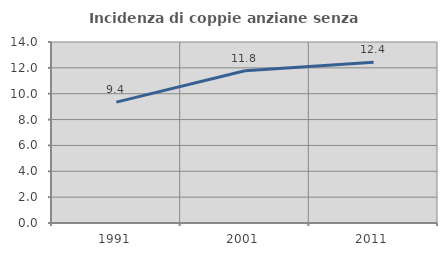
| Category | Incidenza di coppie anziane senza figli  |
|---|---|
| 1991.0 | 9.351 |
| 2001.0 | 11.771 |
| 2011.0 | 12.442 |